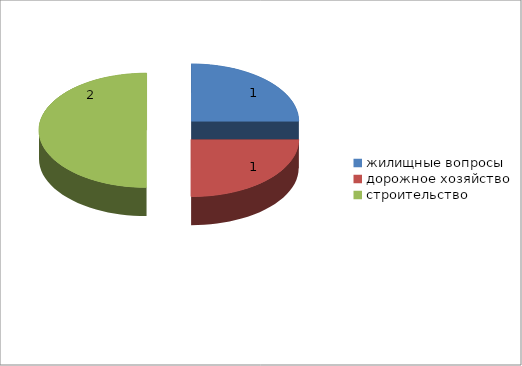
| Category | Series 0 |
|---|---|
| жилищные вопросы | 1 |
| дорожное хозяйство | 1 |
| строительство | 2 |